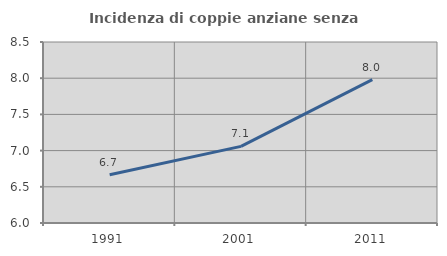
| Category | Incidenza di coppie anziane senza figli  |
|---|---|
| 1991.0 | 6.667 |
| 2001.0 | 7.059 |
| 2011.0 | 7.981 |